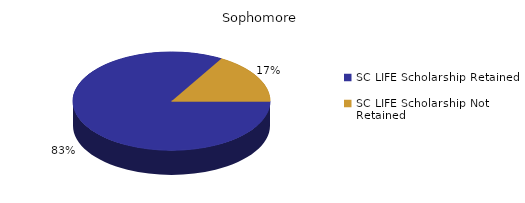
| Category | Sophomore |
|---|---|
| SC LIFE Scholarship Retained  | 1515 |
| SC LIFE Scholarship Not Retained  | 301 |